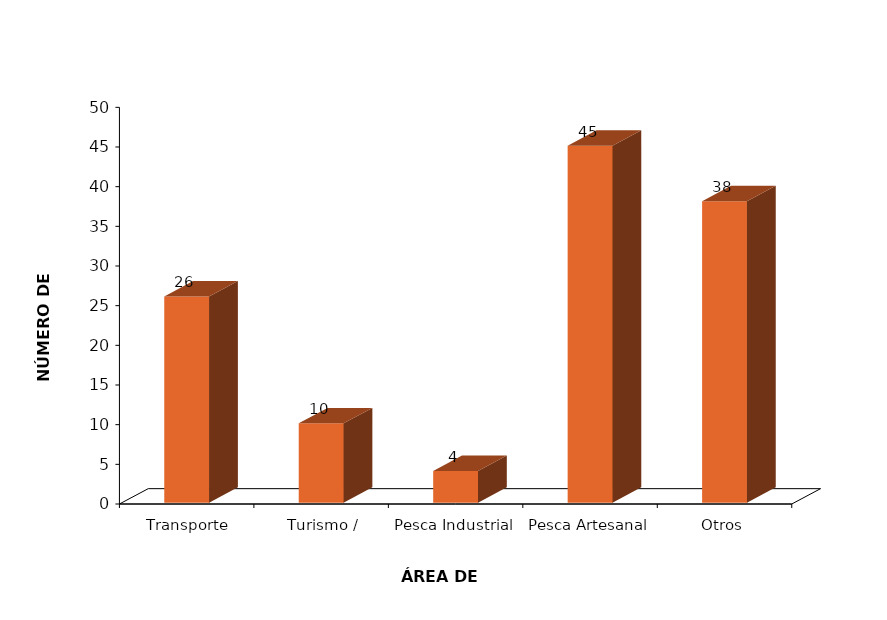
| Category | Series 0 |
|---|---|
| Transporte Marítimo | 26 |
| Turismo / Deportes | 10 |
| Pesca Industrial | 4 |
| Pesca Artesanal | 45 |
| Otros | 38 |